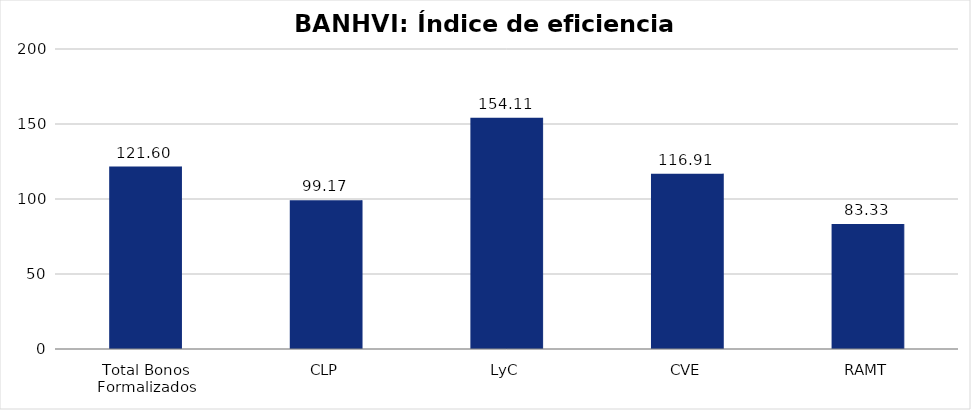
| Category | Índice de eficiencia (IE)  |
|---|---|
| Total Bonos Formalizados | 121.604 |
| CLP | 99.168 |
| LyC | 154.113 |
| CVE | 116.911 |
| RAMT | 83.33 |